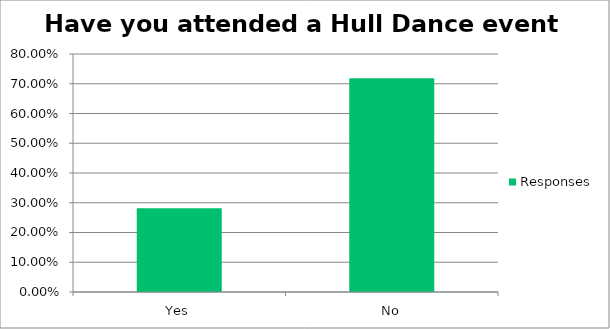
| Category | Responses |
|---|---|
| Yes | 0.281 |
| No | 0.719 |